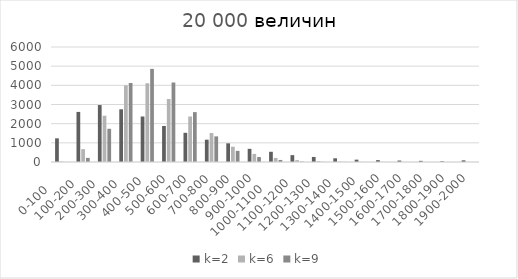
| Category | k=2 | k=6 | k=9 |
|---|---|---|---|
| 0-100     | 1235 | 27 | 3 |
| 100-200   | 2613 | 671 | 214 |
| 200-300   | 2971 | 2414 | 1733 |
| 300-400   | 2750 | 4000 | 4122 |
| 400-500  | 2375 | 4107 | 4860 |
| 500-600 | 1880 | 3287 | 4148 |
| 600-700 | 1523 | 2374 | 2602 |
| 700-800 | 1164 | 1511 | 1337 |
| 800-900 | 974 | 798 | 581 |
| 900-1000 | 686 | 421 | 259 |
| 1000-1100     | 533 | 213 | 107 |
| 1100-1200   | 358 | 97 | 21 |
| 1200-1300   | 263 | 52 | 7 |
| 1300-1400   | 193 | 16 | 6 |
| 1400-1500  | 123 | 6 | 0 |
| 1500-1600 | 97 | 4 | 0 |
| 1600-1700 | 77 | 1 | 0 |
| 1700-1800 | 61 | 0 | 0 |
| 1800-1900 | 38 | 1 | 0 |
| 1900-2000 | 86 | 0 | 0 |